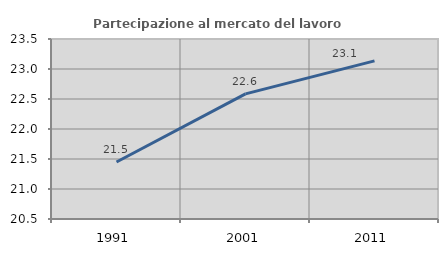
| Category | Partecipazione al mercato del lavoro  femminile |
|---|---|
| 1991.0 | 21.451 |
| 2001.0 | 22.586 |
| 2011.0 | 23.135 |